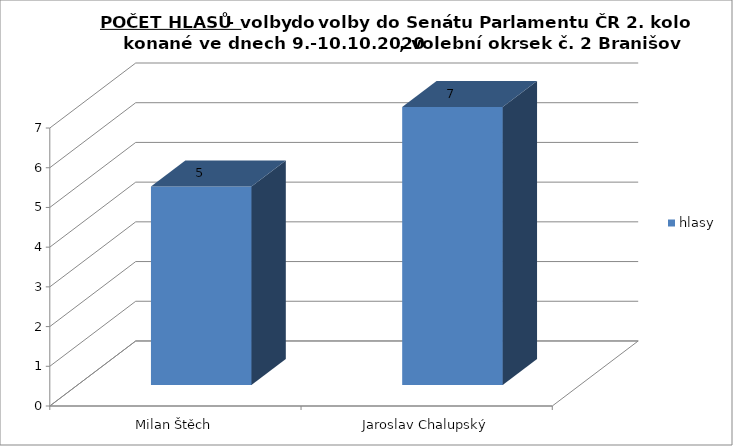
| Category | hlasy |
|---|---|
| Milan Štěch | 5 |
| Jaroslav Chalupský | 7 |